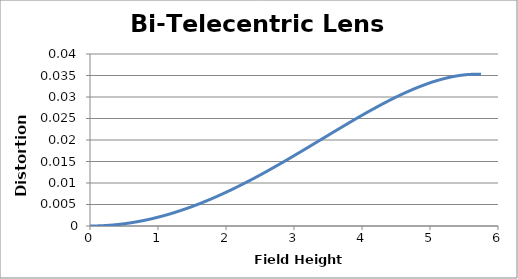
| Category | Distortion (%) |
|---|---|
| 0.0 | 0 |
| 0.0575 | 0 |
| 0.115 | 0 |
| 0.1725 | 0 |
| 0.23 | 0 |
| 0.2875 | 0 |
| 0.345 | 0 |
| 0.4025 | 0 |
| 0.46 | 0 |
| 0.5175 | 0.001 |
| 0.575 | 0.001 |
| 0.6325 | 0.001 |
| 0.69 | 0.001 |
| 0.7475 | 0.001 |
| 0.805 | 0.001 |
| 0.8625 | 0.002 |
| 0.92 | 0.002 |
| 0.9775 | 0.002 |
| 1.035 | 0.002 |
| 1.0925 | 0.002 |
| 1.15 | 0.003 |
| 1.2075 | 0.003 |
| 1.265 | 0.003 |
| 1.3225 | 0.004 |
| 1.38 | 0.004 |
| 1.4375 | 0.004 |
| 1.495 | 0.004 |
| 1.5525 | 0.005 |
| 1.61 | 0.005 |
| 1.6675 | 0.006 |
| 1.725 | 0.006 |
| 1.7825 | 0.006 |
| 1.84 | 0.007 |
| 1.8975 | 0.007 |
| 1.955 | 0.008 |
| 2.0125 | 0.008 |
| 2.07 | 0.008 |
| 2.1275 | 0.009 |
| 2.185 | 0.009 |
| 2.2425 | 0.01 |
| 2.3 | 0.01 |
| 2.3575 | 0.011 |
| 2.415 | 0.011 |
| 2.4725 | 0.012 |
| 2.53 | 0.012 |
| 2.5875 | 0.013 |
| 2.645 | 0.013 |
| 2.7025 | 0.014 |
| 2.76 | 0.014 |
| 2.8175 | 0.015 |
| 2.875 | 0.015 |
| 2.9325 | 0.016 |
| 2.99 | 0.016 |
| 3.0475 | 0.017 |
| 3.105 | 0.017 |
| 3.1625 | 0.018 |
| 3.22 | 0.018 |
| 3.2775 | 0.019 |
| 3.335 | 0.02 |
| 3.3925 | 0.02 |
| 3.45 | 0.021 |
| 3.5075 | 0.021 |
| 3.565 | 0.022 |
| 3.6225 | 0.022 |
| 3.68 | 0.023 |
| 3.7375 | 0.023 |
| 3.795 | 0.024 |
| 3.8525 | 0.024 |
| 3.91 | 0.025 |
| 3.9675 | 0.025 |
| 4.025 | 0.026 |
| 4.0825 | 0.026 |
| 4.14 | 0.027 |
| 4.1975 | 0.027 |
| 4.255 | 0.028 |
| 4.3125 | 0.028 |
| 4.37 | 0.029 |
| 4.4275 | 0.029 |
| 4.485 | 0.03 |
| 4.5425 | 0.03 |
| 4.6 | 0.031 |
| 4.6575 | 0.031 |
| 4.715 | 0.032 |
| 4.7725 | 0.032 |
| 4.83 | 0.032 |
| 4.8875 | 0.033 |
| 4.945 | 0.033 |
| 5.0025 | 0.033 |
| 5.06 | 0.034 |
| 5.1175 | 0.034 |
| 5.175 | 0.034 |
| 5.2325 | 0.034 |
| 5.29 | 0.035 |
| 5.3475 | 0.035 |
| 5.405 | 0.035 |
| 5.4625 | 0.035 |
| 5.52 | 0.035 |
| 5.5775 | 0.035 |
| 5.635 | 0.035 |
| 5.6925 | 0.035 |
| 5.75 | 0.035 |